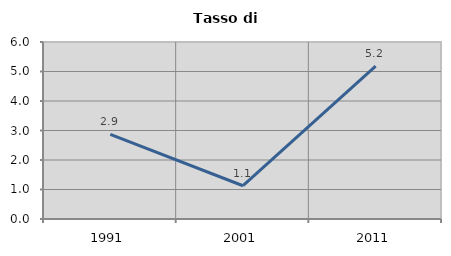
| Category | Tasso di disoccupazione   |
|---|---|
| 1991.0 | 2.867 |
| 2001.0 | 1.128 |
| 2011.0 | 5.185 |